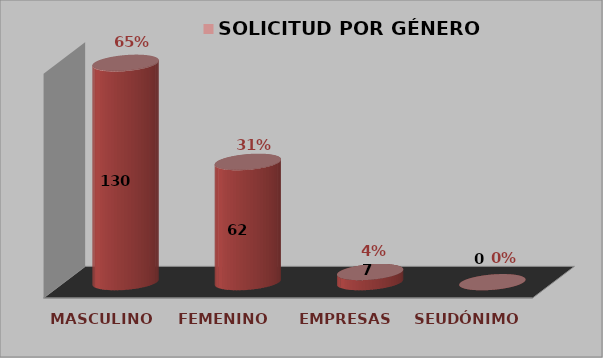
| Category | SOLICITUD POR GÉNERO |
|---|---|
| MASCULINO | 0.627 |
| FEMENINO | 0.344 |
| EMPRESAS | 0.029 |
| SEUDÓNIMO | 0 |